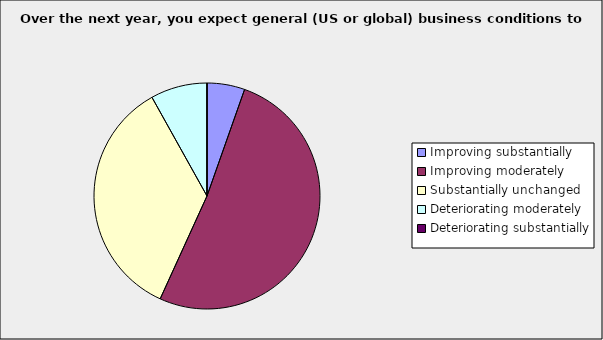
| Category | Series 0 |
|---|---|
| Improving substantially | 0.054 |
| Improving moderately | 0.514 |
| Substantially unchanged | 0.351 |
| Deteriorating moderately | 0.081 |
| Deteriorating substantially | 0 |